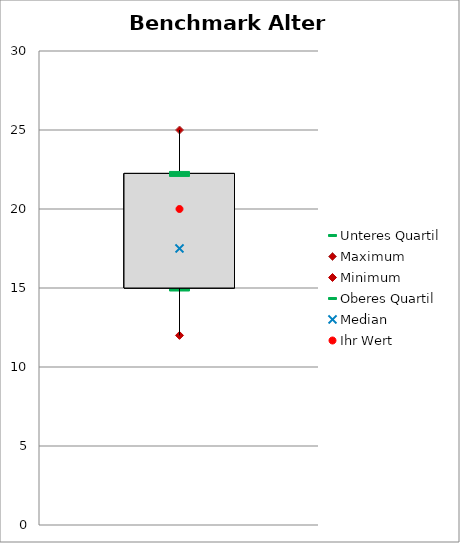
| Category | Unteres Quartil | Maximum | Minimum | Oberes Quartil |
|---|---|---|---|---|
| Alter SB | 15 | 25 | 12 | 22.25 |